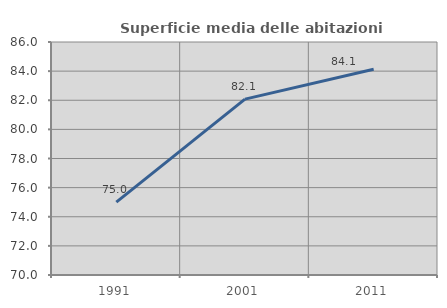
| Category | Superficie media delle abitazioni occupate |
|---|---|
| 1991.0 | 75.01 |
| 2001.0 | 82.075 |
| 2011.0 | 84.123 |